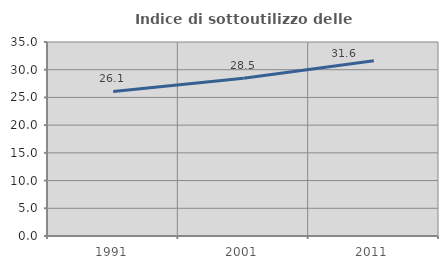
| Category | Indice di sottoutilizzo delle abitazioni  |
|---|---|
| 1991.0 | 26.087 |
| 2001.0 | 28.463 |
| 2011.0 | 31.598 |